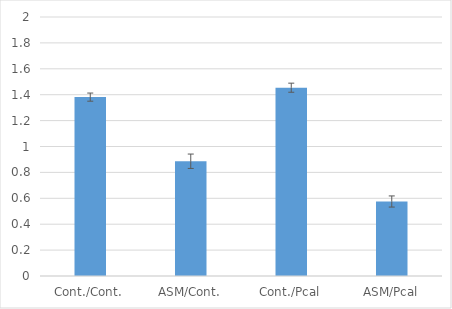
| Category | Series 0 |
|---|---|
| Cont./Cont. | 1.381 |
| ASM/Cont. | 0.886 |
| Cont./Pcal | 1.454 |
| ASM/Pcal | 0.575 |